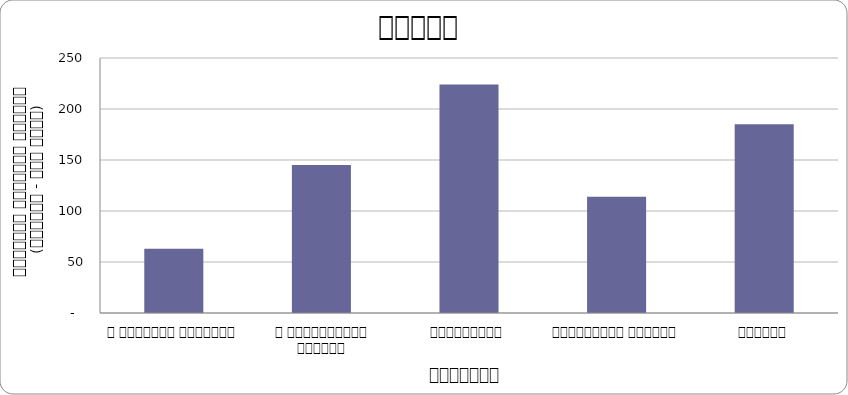
| Category | Series 0 |
|---|---|
| द हिमालयन टाइम्स् | 63 |
| द काठमाण्डौं पोस्ट् | 145 |
| कान्तिपुर | 224 |
| अन्नपूर्ण पोस्ट् | 114 |
| नागरिक | 185 |